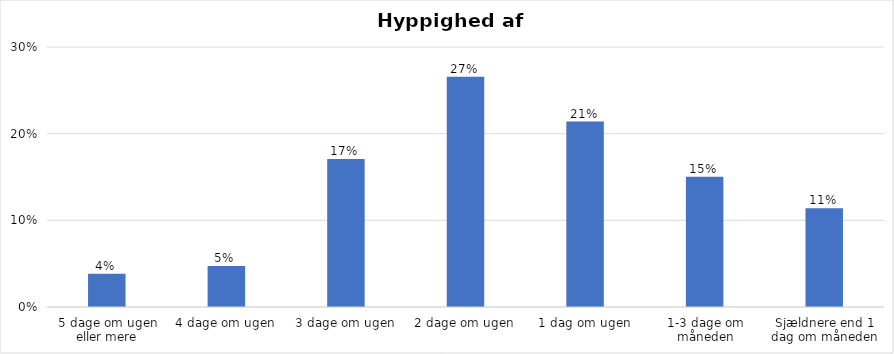
| Category | % |
|---|---|
| 5 dage om ugen eller mere | 0.038 |
| 4 dage om ugen | 0.047 |
| 3 dage om ugen | 0.171 |
| 2 dage om ugen | 0.266 |
| 1 dag om ugen | 0.214 |
| 1-3 dage om måneden | 0.15 |
| Sjældnere end 1 dag om måneden | 0.114 |